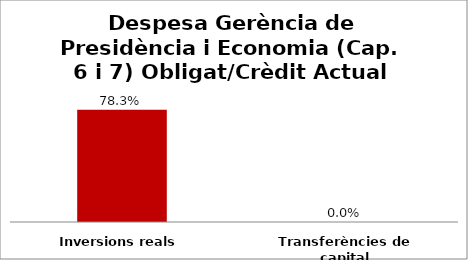
| Category | Series 0 |
|---|---|
| Inversions reals | 0.783 |
| Transferències de capital | 0 |